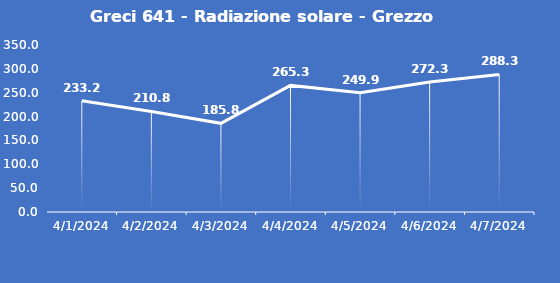
| Category | Greci 641 - Radiazione solare - Grezzo (W/m2) |
|---|---|
| 4/1/24 | 233.2 |
| 4/2/24 | 210.8 |
| 4/3/24 | 185.8 |
| 4/4/24 | 265.3 |
| 4/5/24 | 249.9 |
| 4/6/24 | 272.3 |
| 4/7/24 | 288.3 |